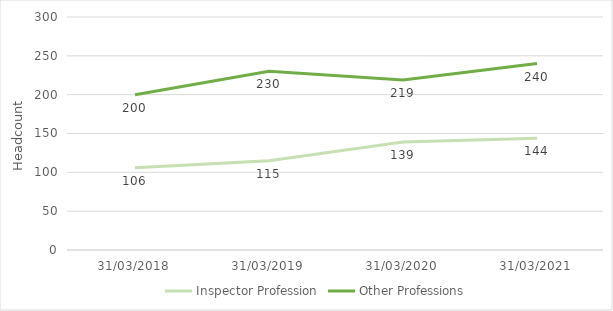
| Category | Inspector Profession | Other Professions |
|---|---|---|
| 31/03/2018 | 106 | 200 |
| 31/03/2019 | 115 | 230 |
| 31/03/2020 | 139 | 219 |
| 31/03/2021 | 144 | 240 |